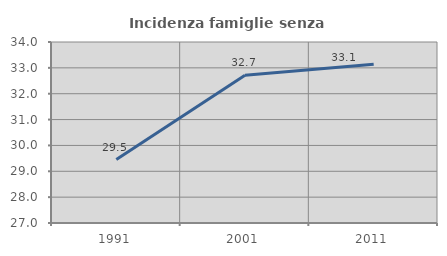
| Category | Incidenza famiglie senza nuclei |
|---|---|
| 1991.0 | 29.452 |
| 2001.0 | 32.716 |
| 2011.0 | 33.143 |